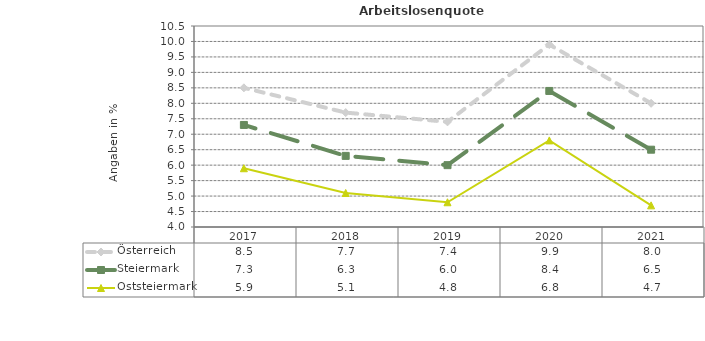
| Category | Österreich | Steiermark | Oststeiermark |
|---|---|---|---|
| 2021.0 | 8 | 6.5 | 4.7 |
| 2020.0 | 9.9 | 8.4 | 6.8 |
| 2019.0 | 7.4 | 6 | 4.8 |
| 2018.0 | 7.7 | 6.3 | 5.1 |
| 2017.0 | 8.5 | 7.3 | 5.9 |